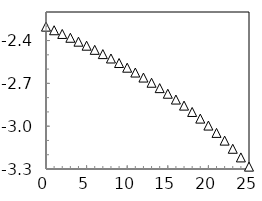
| Category | Series 2 |
|---|---|
| 0.0 | -2.303 |
| 1.0 | -2.328 |
| 2.0 | -2.354 |
| 3.0 | -2.381 |
| 4.0 | -2.408 |
| 5.0 | -2.436 |
| 6.0 | -2.465 |
| 7.0 | -2.495 |
| 8.0 | -2.526 |
| 9.0 | -2.557 |
| 10.0 | -2.59 |
| 11.0 | -2.624 |
| 12.0 | -2.659 |
| 13.0 | -2.696 |
| 14.0 | -2.733 |
| 15.0 | -2.773 |
| 16.0 | -2.813 |
| 17.0 | -2.856 |
| 18.0 | -2.9 |
| 19.0 | -2.947 |
| 20.0 | -2.996 |
| 21.0 | -3.047 |
| 22.0 | -3.101 |
| 23.0 | -3.158 |
| 24.0 | -3.219 |
| 25.0 | -3.283 |